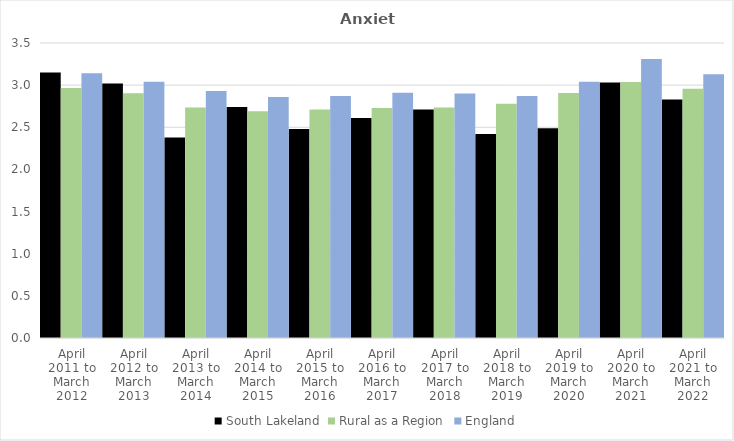
| Category | South Lakeland | Rural as a Region | England |
|---|---|---|---|
| April 2011 to March 2012 | 3.15 | 2.967 | 3.14 |
| April 2012 to March 2013 | 3.02 | 2.904 | 3.04 |
| April 2013 to March 2014 | 2.38 | 2.734 | 2.93 |
| April 2014 to March 2015 | 2.74 | 2.691 | 2.86 |
| April 2015 to March 2016 | 2.48 | 2.711 | 2.87 |
| April 2016 to March 2017 | 2.61 | 2.729 | 2.91 |
| April 2017 to March 2018 | 2.71 | 2.736 | 2.9 |
| April 2018 to March 2019 | 2.42 | 2.78 | 2.87 |
| April 2019 to March 2020 | 2.49 | 2.908 | 3.04 |
| April 2020 to March 2021 | 3.03 | 3.036 | 3.31 |
| April 2021 to March 2022 | 2.83 | 2.956 | 3.13 |